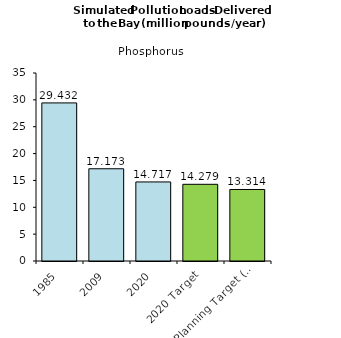
| Category | Series 0 |
|---|---|
| 1985 | 29.432 |
| 2009 | 17.173 |
| 2020 | 14.717 |
| 2020 Target | 14.279 |
| 2025 Planning Target (amt. allowed in Bay)  | 13.314 |